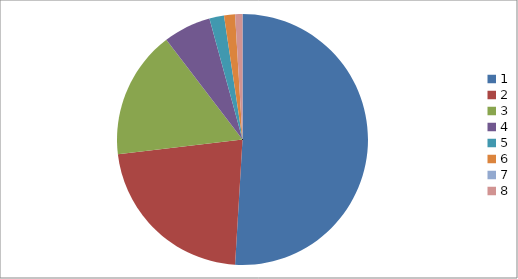
| Category | Series 0 |
|---|---|
| 0 | 108 |
| 1 | 47 |
| 2 | 35 |
| 3 | 13 |
| 4 | 4 |
| 5 | 3 |
| 6 | 0 |
| 7 | 2 |